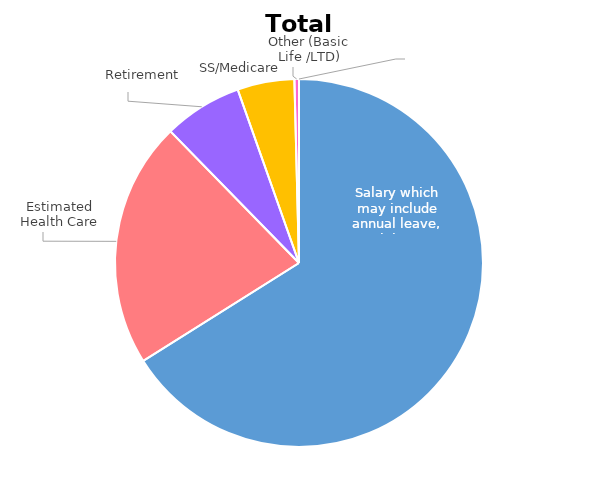
| Category | Series 0 |
|---|---|
| Salary which may include annual leave, sick leave, and holidays | 0.66 |
| Estimated Health Care | 0.216 |
| Retirement | 0.069 |
| SS/Medicare | 0.05 |
| Other (Basic Life /LTD) | 0.004 |